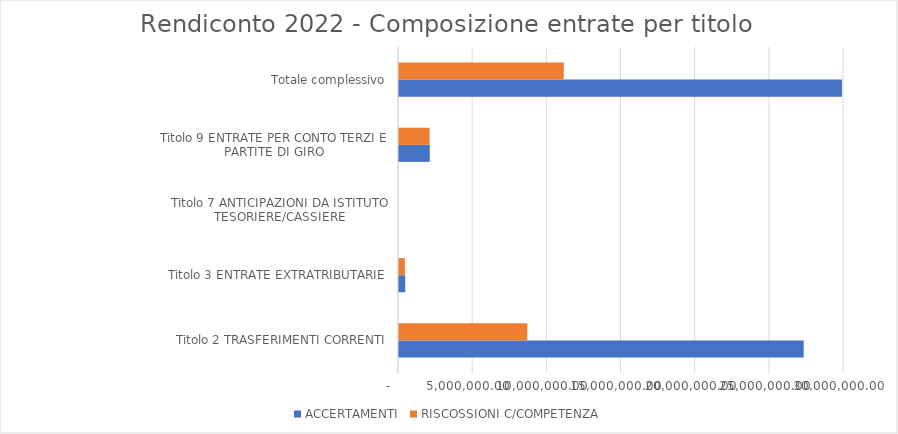
| Category | ACCERTAMENTI | RISCOSSIONI C/COMPETENZA |
|---|---|---|
| Titolo 2 TRASFERIMENTI CORRENTI | 27282390.07 | 8648153.31 |
| Titolo 3 ENTRATE EXTRATRIBUTARIE | 420275.8 | 395954.69 |
| Titolo 7 ANTICIPAZIONI DA ISTITUTO TESORIERE/CASSIERE | 0 | 0 |
| Titolo 9 ENTRATE PER CONTO TERZI E PARTITE DI GIRO | 2074266.91 | 2063385.89 |
| Totale complessivo | 29861016.4 | 11107493.89 |